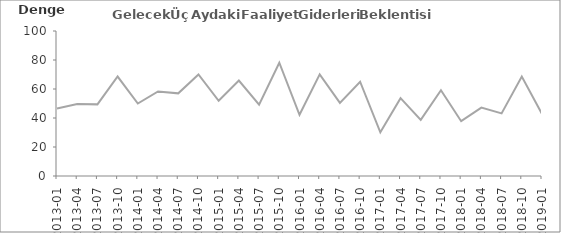
| Category | Gelecek Üç Aydaki Faaliyet Giderleri Beklentisi |
|---|---|
| 2013-01 | 46.5 |
| 2013-04 | 49.6 |
| 2013-07 | 49.4 |
| 2013-10 | 68.6 |
| 2014-01 | 50 |
| 2014-04 | 58.3 |
| 2014-07 | 57 |
| 2014-10 | 70 |
| 2015-01 | 51.9 |
| 2015-04 | 65.8 |
| 2015-07 | 49.2 |
| 2015-10 | 78.1 |
| 2016-01 | 42.2 |
| 2016-04 | 70.1 |
| 2016-07 | 50.4 |
| 2016-10 | 65 |
| 2017-01 | 30.1 |
| 2017-04 | 53.7 |
| 2017-07 | 38.7 |
| 2017-10 | 59.1 |
| 2018-01 | 37.8 |
| 2018-04 | 47.2 |
| 2018-07 | 43.2 |
| 2018-10 | 68.6 |
| 2019-01 | 42.8 |